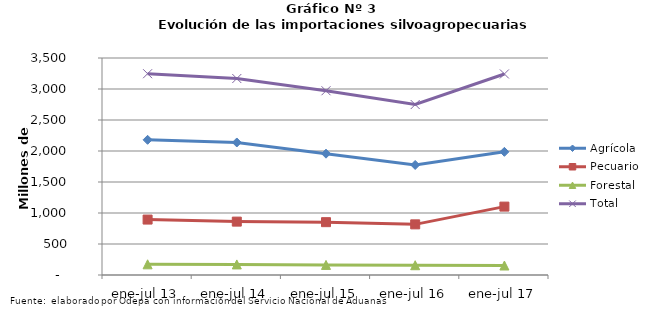
| Category | Agrícola | Pecuario | Forestal | Total |
|---|---|---|---|---|
| ene-jul 13 | 2180332 | 894077 | 172296 | 3246705 |
| ene-jul 14 | 2137508 | 860971 | 170457 | 3168936 |
| ene-jul 15 | 1956884 | 852250 | 162796 | 2971930 |
| ene-jul 16 | 1774759 | 816894 | 157698 | 2749351 |
| ene-jul 17 | 1986368 | 1103070 | 153082 | 3242520 |